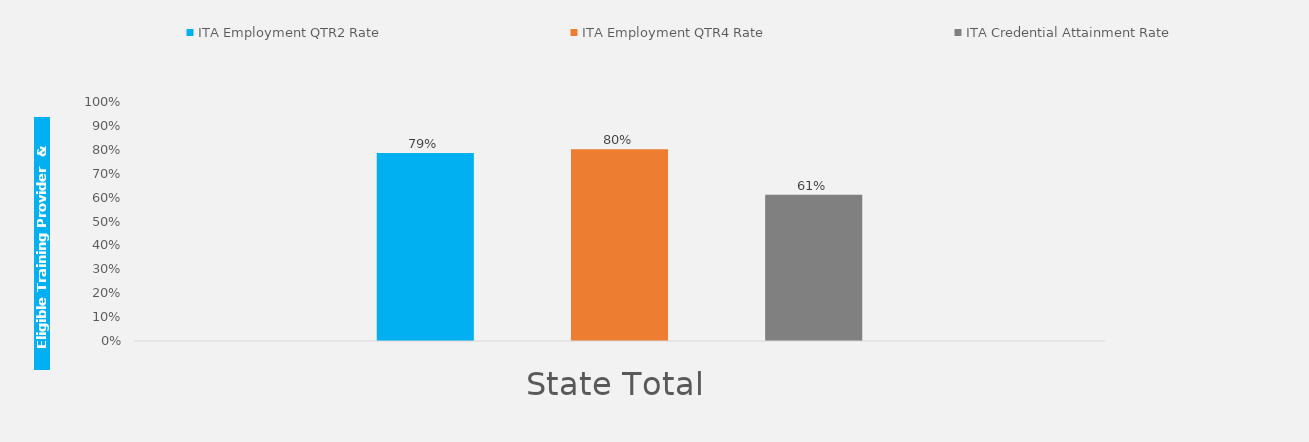
| Category | ITA Employment QTR2 Rate  | ITA Employment QTR4 Rate  | ITA Credential Attainment Rate  |
|---|---|---|---|
| State Total | 0.787 | 0.803 | 0.612 |